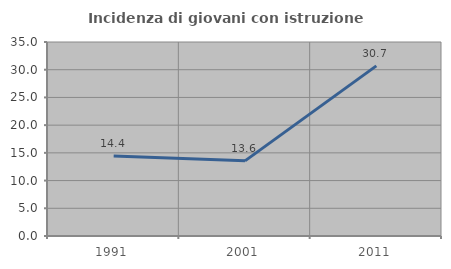
| Category | Incidenza di giovani con istruzione universitaria |
|---|---|
| 1991.0 | 14.444 |
| 2001.0 | 13.559 |
| 2011.0 | 30.693 |